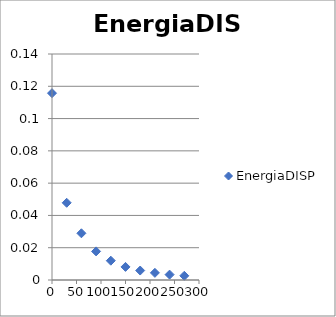
| Category | EnergiaDISP |
|---|---|
| 0.0 | 0.116 |
| 30.0 | 0.048 |
| 60.0 | 0.029 |
| 90.0 | 0.018 |
| 120.0 | 0.012 |
| 150.0 | 0.008 |
| 180.0 | 0.006 |
| 210.0 | 0.004 |
| 240.0 | 0.003 |
| 270.0 | 0.003 |